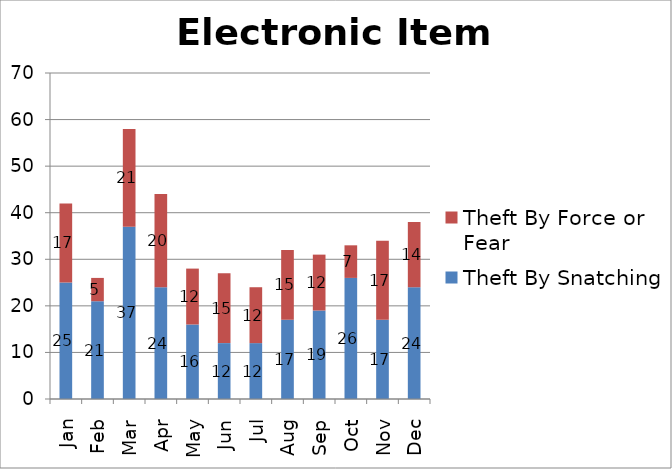
| Category | Theft By Snatching | Theft By Force or Fear |
|---|---|---|
| Jan | 25 | 17 |
| Feb | 21 | 5 |
| Mar | 37 | 21 |
| Apr | 24 | 20 |
| May | 16 | 12 |
| Jun | 12 | 15 |
| Jul | 12 | 12 |
| Aug | 17 | 15 |
| Sep | 19 | 12 |
| Oct | 26 | 7 |
| Nov | 17 | 17 |
| Dec | 24 | 14 |